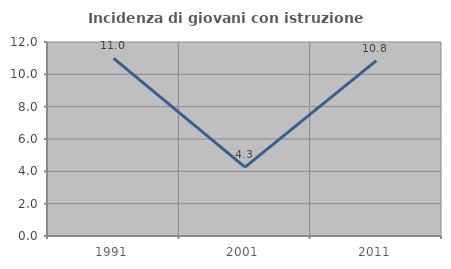
| Category | Incidenza di giovani con istruzione universitaria |
|---|---|
| 1991.0 | 10.989 |
| 2001.0 | 4.255 |
| 2011.0 | 10.843 |